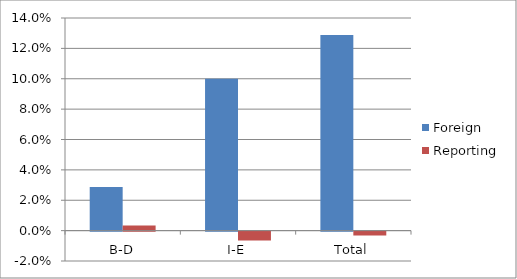
| Category | Foreign | Reporting |
|---|---|---|
| B-D | 0.029 | 0.003 |
| I-E | 0.1 | -0.006 |
| Total | 0.129 | -0.002 |